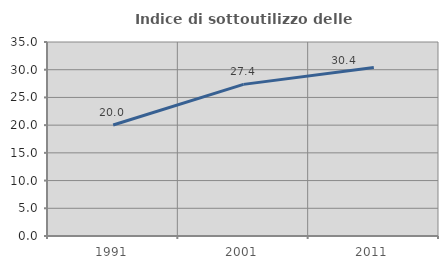
| Category | Indice di sottoutilizzo delle abitazioni  |
|---|---|
| 1991.0 | 20.019 |
| 2001.0 | 27.355 |
| 2011.0 | 30.402 |